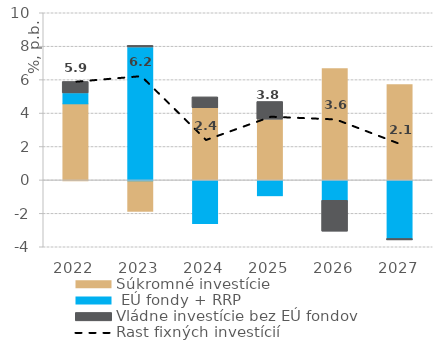
| Category | Súkromné investície |  EÚ fondy + RRP | Vládne investície bez EÚ fondov |
|---|---|---|---|
| 2022.0 | 4.599 | 0.607 | 0.685 |
| 2023.0 | -1.83 | 7.954 | 0.097 |
| 2024.0 | 4.318 | -2.567 | 0.651 |
| 2025.0 | 3.633 | -0.899 | 1.061 |
| 2026.0 | 6.7 | -1.219 | -1.848 |
| 2027.0 | 5.737 | -3.502 | -0.087 |